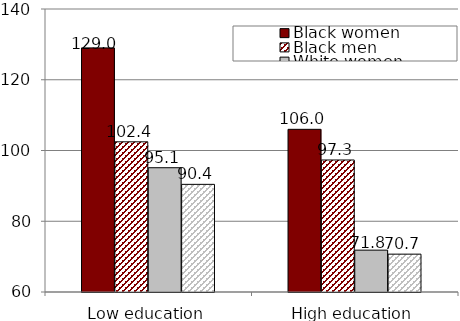
| Category | Black women | Black men | White women | White men |
|---|---|---|---|---|
| Low education | 129.01 | 102.45 | 95.129 | 90.433 |
| High education | 105.987 | 97.317 | 71.833 | 70.701 |